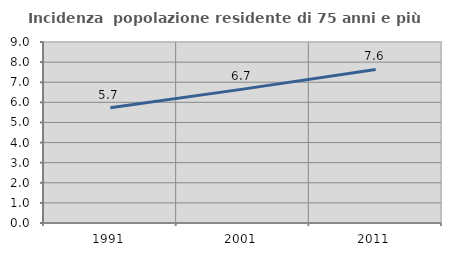
| Category | Incidenza  popolazione residente di 75 anni e più |
|---|---|
| 1991.0 | 5.726 |
| 2001.0 | 6.657 |
| 2011.0 | 7.638 |